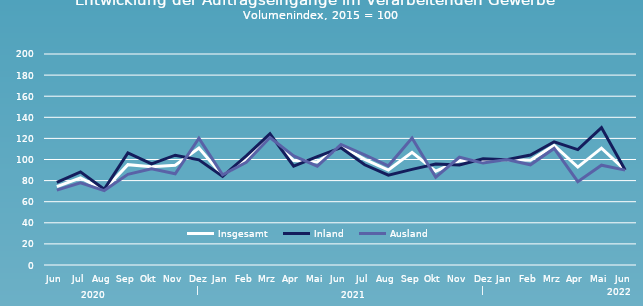
| Category | Insgesamt | Inland | Ausland |
|---|---|---|---|
| Jun | 74.224 | 78.205 | 70.907 |
| Jul | 82.615 | 88.253 | 77.918 |
| Aug | 71.102 | 71.798 | 70.522 |
| Sep | 95.122 | 106.151 | 85.931 |
| Okt | 93.215 | 95.755 | 91.098 |
| Nov | 94.47 | 104.086 | 86.456 |
| Dez | | 110.82 | 99.642 | 120.135 |
| Jan | 84.76 | 83.99 | 85.401 |
| Feb | 100.116 | 103.45 | 97.337 |
| Mrz | 122.448 | 124.336 | 120.874 |
| Apr | 99.043 | 93.725 | 103.474 |
| Mai | 97.73 | 102.645 | 93.634 |
| Jun | 112.866 | 111.207 | 114.248 |
| Jul | 100.112 | 95.008 | 104.364 |
| Aug | 90.019 | 85.198 | 94.037 |
| Sep | 106.841 | 90.604 | 120.371 |
| Okt | 88.893 | 95.702 | 83.219 |
| Nov | 98.762 | 94.719 | 102.132 |
| Dez | | 98.452 | 100.679 | 96.597 |
| Jan | 99.9 | 99.8 | 100 |
| Feb | 99.2 | 104.2 | 95 |
| Mrz | 113.4 | 116.8 | 110.5 |
| Apr | 92.8 | 109.4 | 79 |
| Mai | 110.8 | 130.2 | 94.6 |
| Jun | 90 | 90.1 | 89.9 |